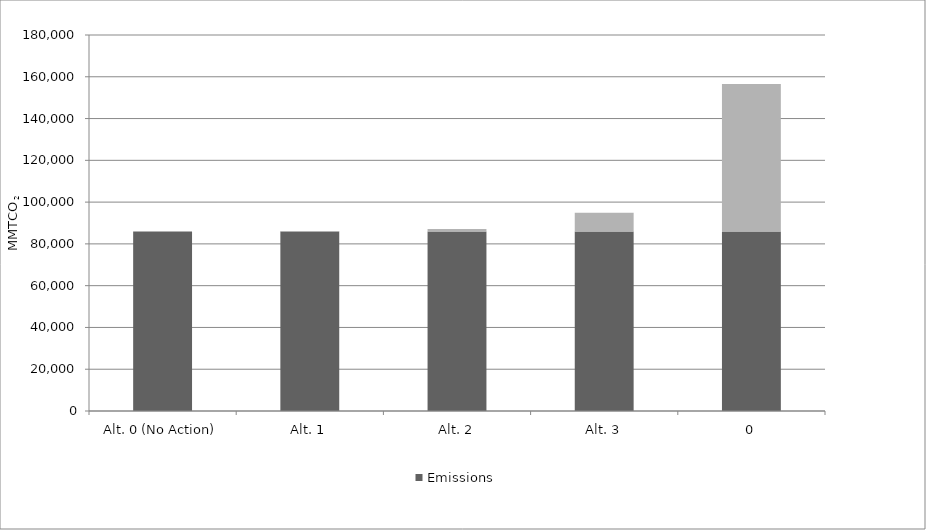
| Category | Emissions | Emissions Difference Compared to No Action Alternative |
|---|---|---|
| Alt. 0 (No Action) | 85900 | 0 |
| Alt. 1 | 85900 | 300 |
| Alt. 2 | 85900 | 1200 |
| Alt. 3 | 85900 | 9000 |
| 0 | 85900 | 70600 |